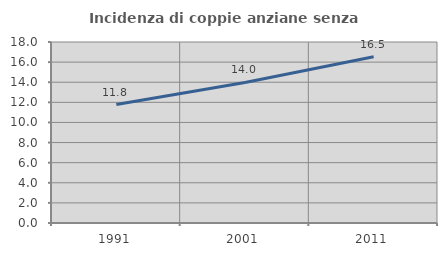
| Category | Incidenza di coppie anziane senza figli  |
|---|---|
| 1991.0 | 11.778 |
| 2001.0 | 13.981 |
| 2011.0 | 16.542 |